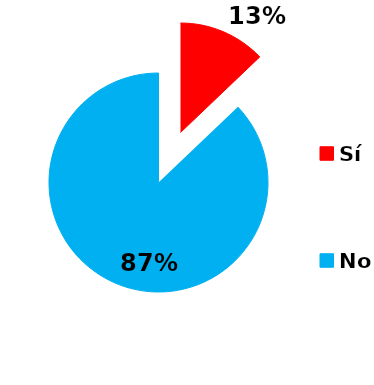
| Category | Series 0 |
|---|---|
| Sí | 17 |
| No | 115 |